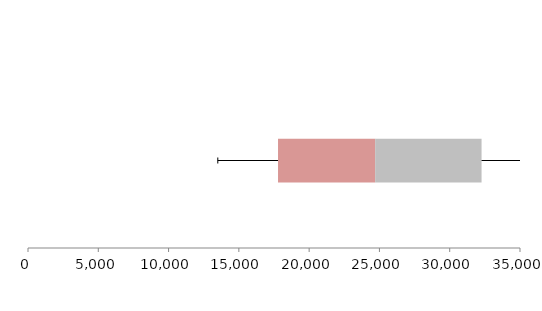
| Category | Series 1 | Series 2 | Series 3 |
|---|---|---|---|
| 0 | 17785.759 | 6910.465 | 7569.279 |